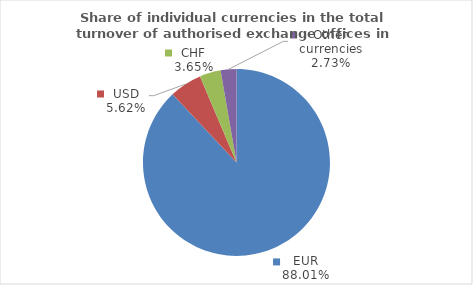
| Category | Series 0 |
|---|---|
| EUR | 88.005 |
| USD | 5.616 |
| CHF | 3.651 |
| Other currencies | 2.727 |